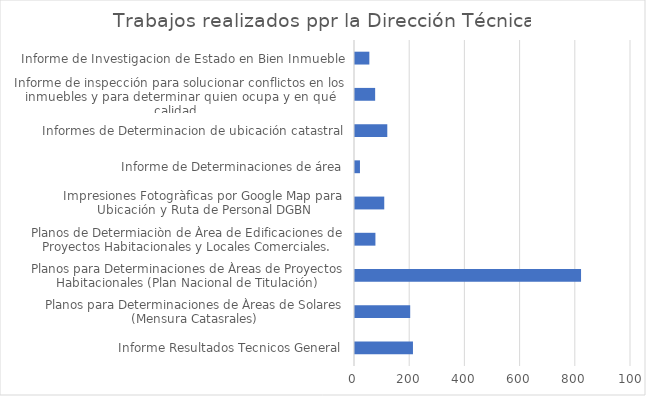
| Category | Series 0 |
|---|---|
| Informe Resultados Tecnicos General | 210 |
| Planos para Determinaciones de Àreas de Solares (Mensura Catasrales) | 200 |
| Planos para Determinaciones de Àreas de Proyectos Habitacionales (Plan Nacional de Titulación) | 819 |
| Planos de Determiaciòn de Àrea de Edificaciones de Proyectos Habitacionales y Locales Comerciales. | 74 |
| Impresiones Fotogràficas por Google Map para Ubicación y Ruta de Personal DGBN | 106 |
| Informe de Determinaciones de área | 18 |
| Informes de Determinacion de ubicación catastral | 117 |
| Informe de inspección para solucionar conflictos en los inmuebles y para determinar quien ocupa y en qué calidad.  | 73 |
| Informe de Investigacion de Estado en Bien Inmueble | 52 |